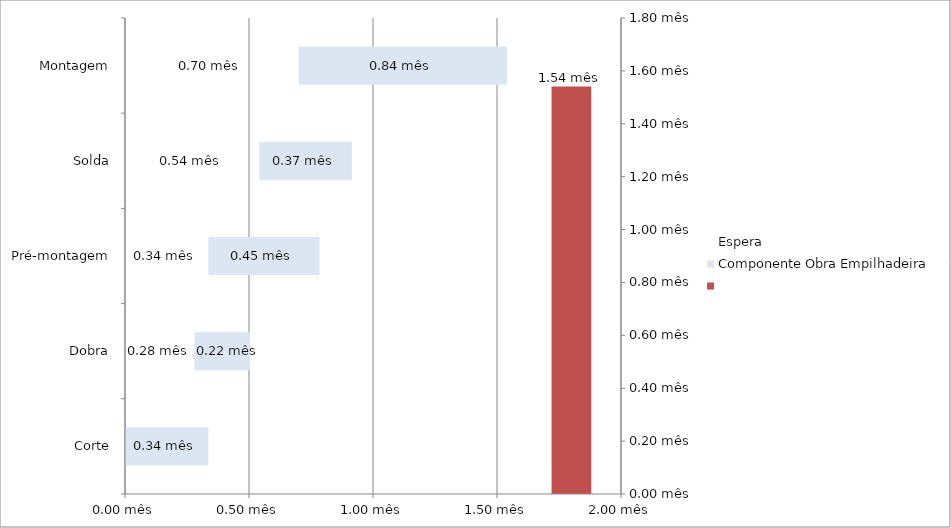
| Category | Espera | Componente Obra Empilhadeira |
|---|---|---|
| Corte | 0 | 0.336 |
| Dobra | 0.28 | 0.224 |
| Pré-montagem | 0.336 | 0.448 |
| Solda | 0.542 | 0.373 |
| Montagem | 0.7 | 0.84 |